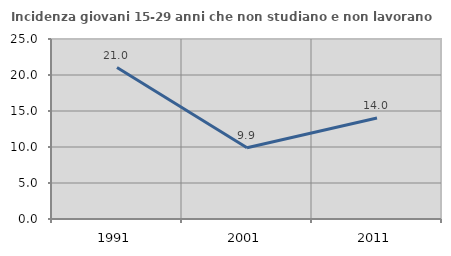
| Category | Incidenza giovani 15-29 anni che non studiano e non lavorano  |
|---|---|
| 1991.0 | 21.037 |
| 2001.0 | 9.905 |
| 2011.0 | 14.019 |